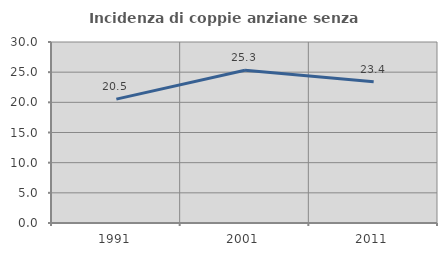
| Category | Incidenza di coppie anziane senza figli  |
|---|---|
| 1991.0 | 20.536 |
| 2001.0 | 25.32 |
| 2011.0 | 23.421 |